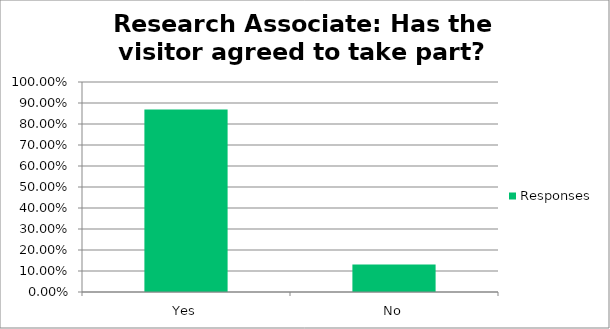
| Category | Responses |
|---|---|
| Yes | 0.869 |
| No | 0.131 |